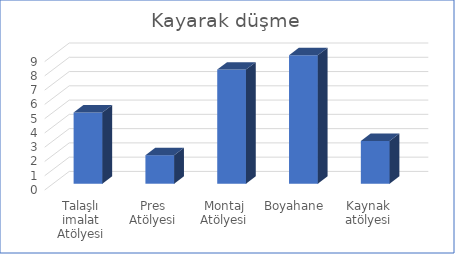
| Category | Kayarak düşme |
|---|---|
| Talaşlı imalat Atölyesi | 5 |
| Pres Atölyesi | 2 |
| Montaj Atölyesi | 8 |
| Boyahane | 9 |
| Kaynak atölyesi | 3 |